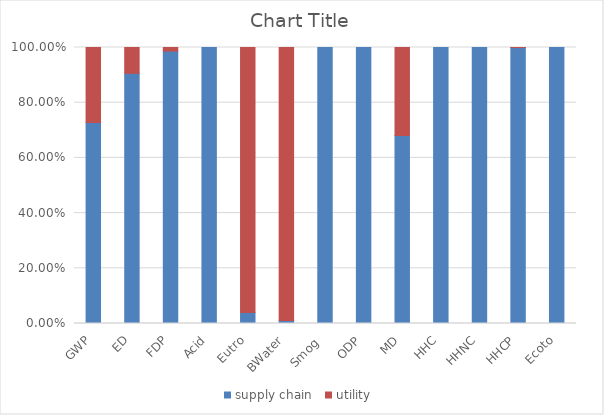
| Category | supply chain  | utility  |
|---|---|---|
| GWP | 0.728 | 0.272 |
| ED | 0.906 | 0.094 |
| FDP | 0.987 | 0.013 |
| Acid | 1 | 0 |
| Eutro | 0.04 | 0.96 |
| BWater | 0.01 | 0.99 |
| Smog  | 1 | 0 |
| ODP | 1 | 0 |
| MD | 0.682 | 0.318 |
| HHC | 1 | 0 |
| HHNC | 1 | 0 |
| HHCP | 1 | 0 |
| Ecoto | 1 | 0 |